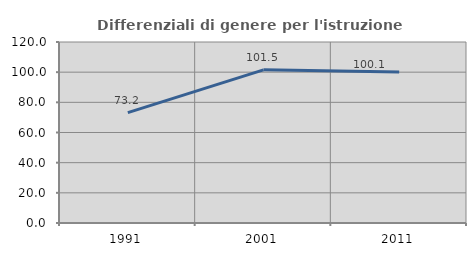
| Category | Differenziali di genere per l'istruzione superiore |
|---|---|
| 1991.0 | 73.159 |
| 2001.0 | 101.538 |
| 2011.0 | 100.116 |